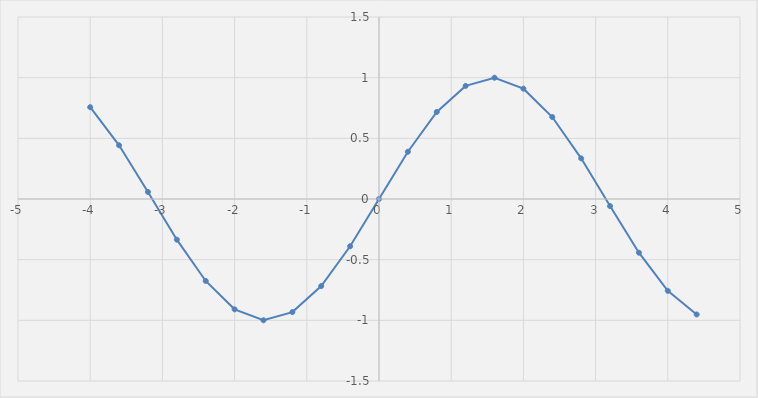
| Category | y |
|---|---|
| -4.0 | 0.757 |
| -3.6 | 0.443 |
| -3.2 | 0.058 |
| -2.8 | -0.335 |
| -2.4 | -0.675 |
| -2.0 | -0.909 |
| -1.6 | -1 |
| -1.2 | -0.932 |
| -0.8 | -0.717 |
| -0.4 | -0.389 |
| 0.0 | 0 |
| 0.4 | 0.389 |
| 0.8 | 0.717 |
| 1.2 | 0.932 |
| 1.6 | 1 |
| 2.0 | 0.909 |
| 2.4 | 0.675 |
| 2.8 | 0.335 |
| 3.2 | -0.058 |
| 3.6 | -0.443 |
| 4.0 | -0.757 |
| 4.4 | -0.952 |